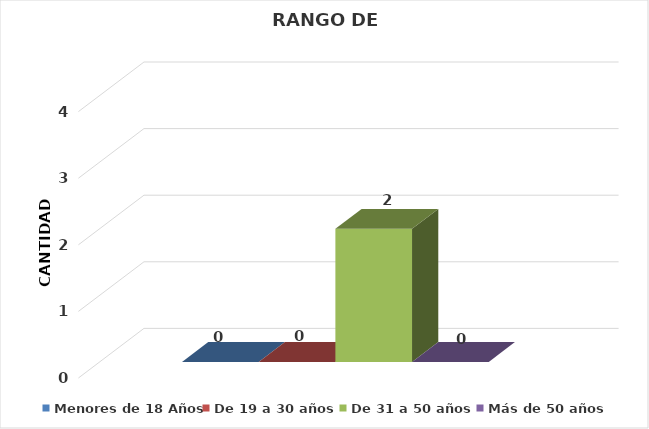
| Category | Menores de 18 Años | De 19 a 30 años  | De 31 a 50 años  | Más de 50 años  |
|---|---|---|---|---|
| 0 | 0 | 0 | 2 | 0 |